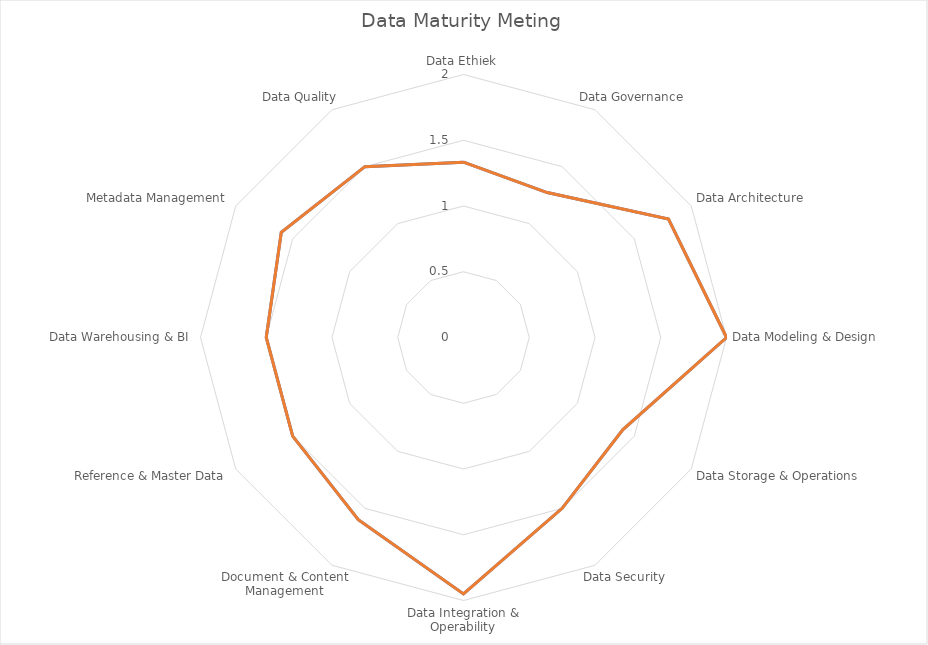
| Category | Gemiddeld |
|---|---|
| Data Ethiek | 1.333 |
| Data Governance | 1.273 |
| Data Architecture | 1.8 |
| Data Modeling & Design | 2 |
| Data Storage & Operations | 1.4 |
| Data Security | 1.5 |
| Data Integration & Operability | 1.95 |
| Document & Content Management | 1.6 |
| Reference & Master Data | 1.5 |
| Data Warehousing & BI | 1.5 |
| Metadata Management | 1.6 |
| Data Quality | 1.5 |